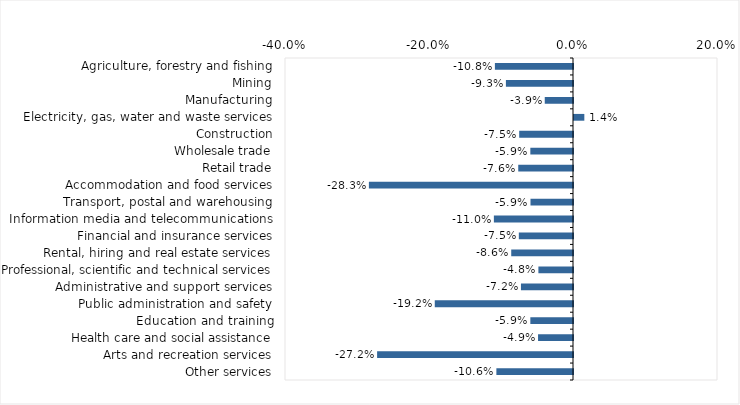
| Category | This week |
|---|---|
| Agriculture, forestry and fishing | -0.108 |
| Mining | -0.093 |
| Manufacturing | -0.039 |
| Electricity, gas, water and waste services | 0.014 |
| Construction | -0.075 |
| Wholesale trade | -0.059 |
| Retail trade | -0.076 |
| Accommodation and food services | -0.283 |
| Transport, postal and warehousing | -0.059 |
| Information media and telecommunications | -0.11 |
| Financial and insurance services | -0.075 |
| Rental, hiring and real estate services | -0.086 |
| Professional, scientific and technical services | -0.048 |
| Administrative and support services | -0.072 |
| Public administration and safety | -0.192 |
| Education and training | -0.059 |
| Health care and social assistance | -0.049 |
| Arts and recreation services | -0.272 |
| Other services | -0.106 |